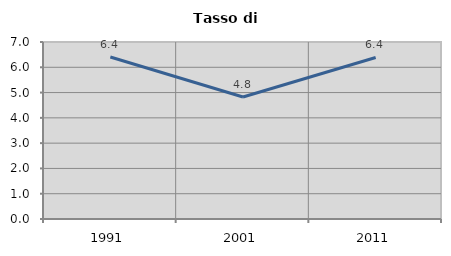
| Category | Tasso di disoccupazione   |
|---|---|
| 1991.0 | 6.408 |
| 2001.0 | 4.825 |
| 2011.0 | 6.387 |